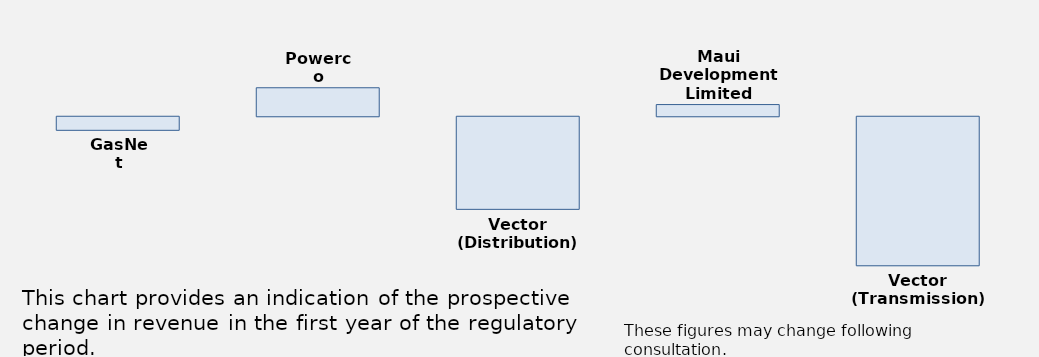
| Category | Series 0 |
|---|---|
| GasNet | -0.023 |
| Powerco | 0.048 |
| Vector (Distribution) | -0.156 |
| Maui Development
Limited | 0.02 |
| Vector (Transmission) | -0.252 |